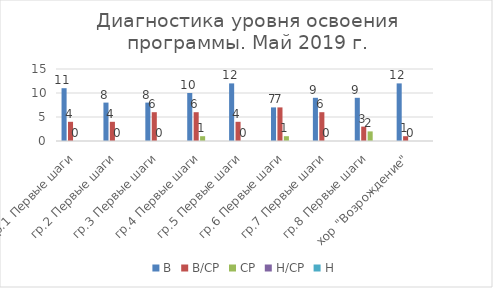
| Category | В | В/СР | СР | Н/СР | Н |
|---|---|---|---|---|---|
| гр.1 Первые шаги | 11 | 4 | 0 | 0 | 0 |
| гр.2 Первые шаги | 8 | 4 | 0 | 0 | 0 |
| гр.3 Первые шаги | 8 | 6 | 0 | 0 | 0 |
| гр.4 Первые шаги | 10 | 6 | 1 | 0 | 0 |
| гр.5 Первые шаги | 12 | 4 | 0 | 0 | 0 |
| гр.6 Первые шаги | 7 | 7 | 1 | 0 | 0 |
| гр.7 Первые шаги | 9 | 6 | 0 | 0 | 0 |
| гр.8 Первые шаги | 9 | 3 | 2 | 0 | 0 |
| хор "Возрождение" | 12 | 1 | 0 | 0 | 0 |